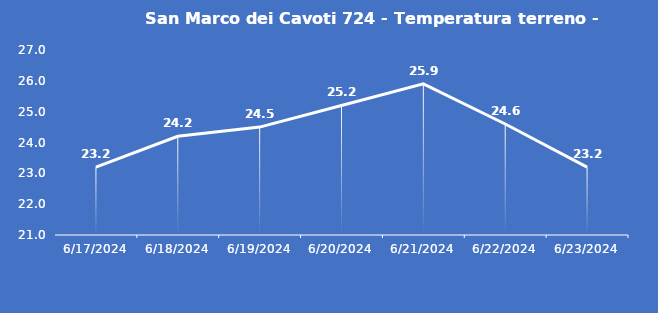
| Category | San Marco dei Cavoti 724 - Temperatura terreno - Grezzo (°C) |
|---|---|
| 6/17/24 | 23.2 |
| 6/18/24 | 24.2 |
| 6/19/24 | 24.5 |
| 6/20/24 | 25.2 |
| 6/21/24 | 25.9 |
| 6/22/24 | 24.6 |
| 6/23/24 | 23.2 |